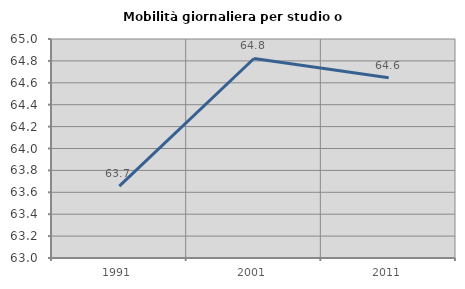
| Category | Mobilità giornaliera per studio o lavoro |
|---|---|
| 1991.0 | 63.656 |
| 2001.0 | 64.822 |
| 2011.0 | 64.646 |